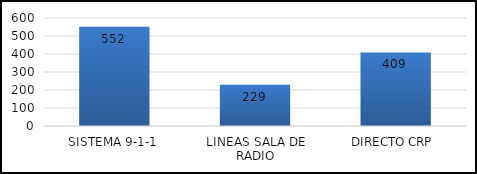
| Category | TOTAL |
|---|---|
| SISTEMA 9-1-1 | 552 |
| LINEAS SALA DE RADIO | 229 |
| DIRECTO CRP  | 409 |